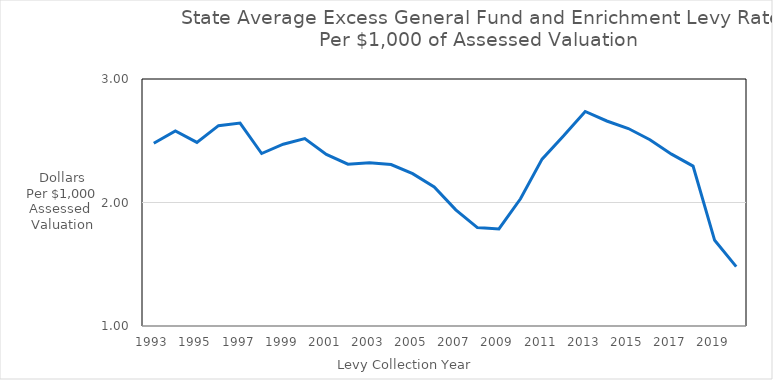
| Category | Series 0 |
|---|---|
| 1993 | 2.48 |
| 1994 | 2.579 |
| 1995 | 2.486 |
| 1996 | 2.622 |
| 1997 | 2.643 |
| 1998 | 2.397 |
| 1999 | 2.472 |
| 2000 | 2.518 |
| 2001 | 2.389 |
| 2002 | 2.31 |
| 2003 | 2.322 |
| 2004 | 2.308 |
| 2005 | 2.233 |
| 2006 | 2.126 |
| 2007 | 1.941 |
| 2008 | 1.797 |
| 2009 | 1.786 |
| 2010 | 2.03 |
| 2011 | 2.351 |
| 2012 | 2.54 |
| 2013 | 2.737 |
| 2014 | 2.66 |
| 2015 | 2.599 |
| 2016 | 2.508 |
| 2017 | 2.391 |
| 2018 | 2.295 |
| 2019 | 1.694 |
| 2020 | 1.481 |